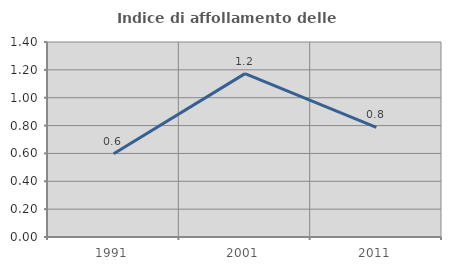
| Category | Indice di affollamento delle abitazioni  |
|---|---|
| 1991.0 | 0.597 |
| 2001.0 | 1.173 |
| 2011.0 | 0.787 |